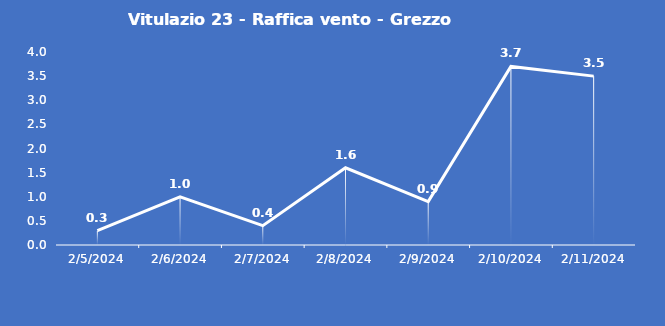
| Category | Vitulazio 23 - Raffica vento - Grezzo (m/s) |
|---|---|
| 2/5/24 | 0.3 |
| 2/6/24 | 1 |
| 2/7/24 | 0.4 |
| 2/8/24 | 1.6 |
| 2/9/24 | 0.9 |
| 2/10/24 | 3.7 |
| 2/11/24 | 3.5 |